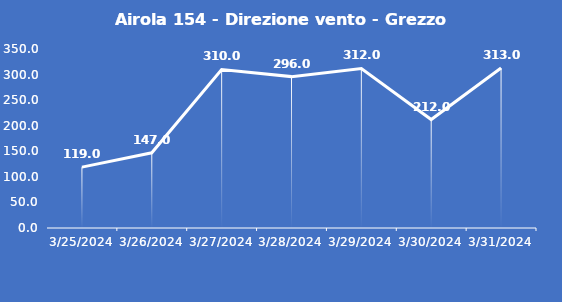
| Category | Airola 154 - Direzione vento - Grezzo (°N) |
|---|---|
| 3/25/24 | 119 |
| 3/26/24 | 147 |
| 3/27/24 | 310 |
| 3/28/24 | 296 |
| 3/29/24 | 312 |
| 3/30/24 | 212 |
| 3/31/24 | 313 |